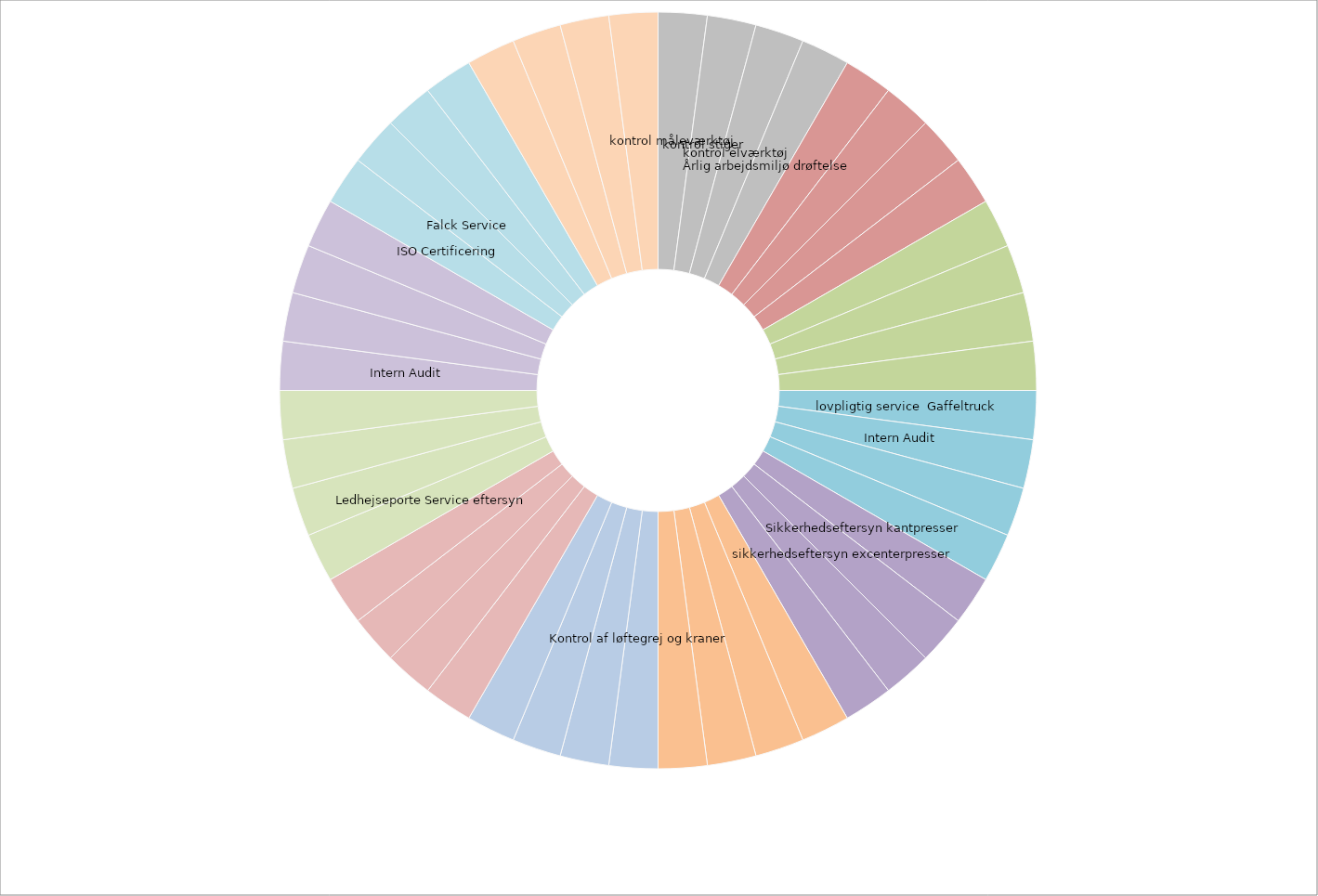
| Category | Series 0 |
|---|---|
| kontrol måleværktøj | 10 |
| kontrol stiger | 10 |
| kontrol elværktøj | 10 |
| Årlig arbejdsmiljø drøftelse | 10 |
|  | 10 |
|  | 10 |
|  | 10 |
|  | 10 |
|  | 10 |
|  | 10 |
|  | 10 |
|  | 10 |
|  lovpligtig service  Gaffeltruck | 10 |
| Intern Audit | 10 |
|  | 10 |
|  | 10 |
| Sikkerhedseftersyn kantpresser | 10 |
| sikkerhedseftersyn excenterpresser | 10 |
|  | 10 |
|  | 10 |
|  | 10 |
|  | 10 |
|  | 10 |
|  | 10 |
| Kontrol af løftegrej og kraner | 10 |
|  | 10 |
|  | 10 |
|  | 10 |
|  | 10 |
|  | 10 |
|  | 10 |
|  | 10 |
| Ledhejseporte Service eftersyn | 10 |
|  | 10 |
|  | 10 |
|  | 10 |
| Intern Audit | 10 |
|  | 10 |
|  | 10 |
|  | 10 |
| ISO Certificering | 10 |
| Falck Service | 10 |